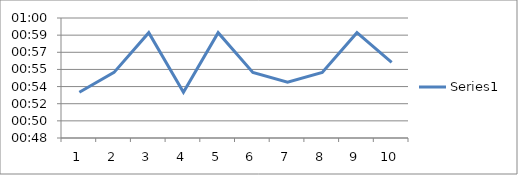
| Category | Series 0 |
|---|---|
| 0 | 0.001 |
| 1 | 0.001 |
| 2 | 0.001 |
| 3 | 0.001 |
| 4 | 0.001 |
| 5 | 0.001 |
| 6 | 0.001 |
| 7 | 0.001 |
| 8 | 0.001 |
| 9 | 0.001 |